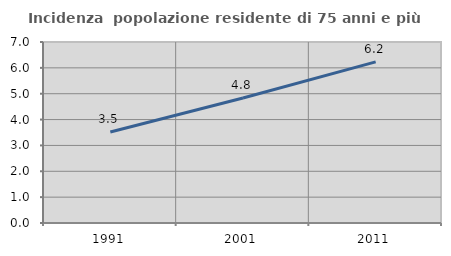
| Category | Incidenza  popolazione residente di 75 anni e più |
|---|---|
| 1991.0 | 3.518 |
| 2001.0 | 4.836 |
| 2011.0 | 6.231 |